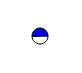
| Category | Series 0 |
|---|---|
| 0 | 2504146 |
| 1 | 2582640 |